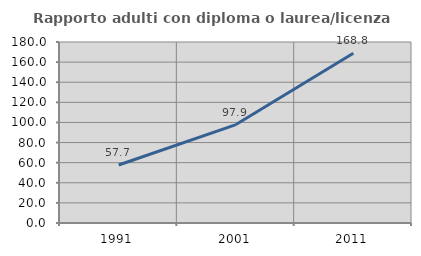
| Category | Rapporto adulti con diploma o laurea/licenza media  |
|---|---|
| 1991.0 | 57.661 |
| 2001.0 | 97.887 |
| 2011.0 | 168.75 |